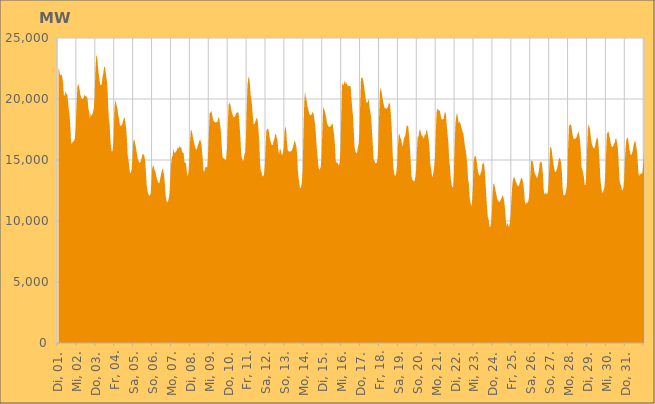
| Category | Series 0 |
|---|---|
|  Di, 01.  | 22526.912 |
|  Di, 01.  | 22406.47 |
|  Di, 01.  | 21989.148 |
|  Di, 01.  | 21965.443 |
|  Di, 01.  | 22028.439 |
|  Di, 01.  | 21820.703 |
|  Di, 01.  | 21253.685 |
|  Di, 01.  | 20283.71 |
|  Di, 01.  | 20286.872 |
|  Di, 01.  | 20639.085 |
|  Di, 01.  | 20378.123 |
|  Di, 01.  | 20430.647 |
|  Di, 01.  | 19952.085 |
|  Di, 01.  | 19266.77 |
|  Di, 01.  | 18798.444 |
|  Di, 01.  | 17992.358 |
|  Di, 01.  | 16539.653 |
|  Mi, 02.  | 16284.732 |
|  Mi, 02.  | 16468.351 |
|  Mi, 02.  | 16555.082 |
|  Mi, 02.  | 16588.426 |
|  Mi, 02.  | 16804.583 |
|  Mi, 02.  | 17676.935 |
|  Mi, 02.  | 19455.206 |
|  Mi, 02.  | 20907.275 |
|  Mi, 02.  | 21263.114 |
|  Mi, 02.  | 21076.309 |
|  Mi, 02.  | 20719.563 |
|  Mi, 02.  | 20308.935 |
|  Mi, 02.  | 20105.747 |
|  Mi, 02.  | 20027.46 |
|  Mi, 02.  | 19998.727 |
|  Mi, 02.  | 20086.994 |
|  Mi, 02.  | 20356.165 |
|  Mi, 02.  | 20253.7 |
|  Mi, 02.  | 20218.26 |
|  Mi, 02.  | 20175.446 |
|  Mi, 02.  | 20010.15 |
|  Mi, 02.  | 19281.716 |
|  Mi, 02.  | 18906.304 |
|  Mi, 02.  | 18372.11 |
|  Do, 03.  | 18882.86 |
|  Do, 03.  | 18619.857 |
|  Do, 03.  | 18733.641 |
|  Do, 03.  | 18971.01 |
|  Do, 03.  | 19254.271 |
|  Do, 03.  | 20239.907 |
|  Do, 03.  | 22328.887 |
|  Do, 03.  | 23492.492 |
|  Do, 03.  | 23588.237 |
|  Do, 03.  | 22831.201 |
|  Do, 03.  | 22163.632 |
|  Do, 03.  | 21636.121 |
|  Do, 03.  | 21193.936 |
|  Do, 03.  | 21118.185 |
|  Do, 03.  | 21237.434 |
|  Do, 03.  | 21796.794 |
|  Do, 03.  | 22096.659 |
|  Do, 03.  | 22604.857 |
|  Do, 03.  | 22661.318 |
|  Do, 03.  | 22188.368 |
|  Do, 03.  | 21771.582 |
|  Do, 03.  | 21208.761 |
|  Do, 03.  | 19807.59 |
|  Do, 03.  | 18420.216 |
|  Fr, 04.  | 17906.003 |
|  Fr, 04.  | 16696.859 |
|  Fr, 04.  | 15925.515 |
|  Fr, 04.  | 15645.8 |
|  Fr, 04.  | 15858.253 |
|  Fr, 04.  | 16788.981 |
|  Fr, 04.  | 18909.759 |
|  Fr, 04.  | 19889.047 |
|  Fr, 04.  | 19709.015 |
|  Fr, 04.  | 19441.737 |
|  Fr, 04.  | 19157.858 |
|  Fr, 04.  | 18656.159 |
|  Fr, 04.  | 18346.415 |
|  Fr, 04.  | 17889.253 |
|  Fr, 04.  | 17779.888 |
|  Fr, 04.  | 17839.608 |
|  Fr, 04.  | 17947.852 |
|  Fr, 04.  | 18161.034 |
|  Fr, 04.  | 18440.259 |
|  Fr, 04.  | 18484.526 |
|  Fr, 04.  | 18109.087 |
|  Fr, 04.  | 17586.284 |
|  Fr, 04.  | 16702.706 |
|  Fr, 04.  | 15339.548 |
|  Sa, 05.  | 15013.379 |
|  Sa, 05.  | 14373.271 |
|  Sa, 05.  | 13910.728 |
|  Sa, 05.  | 13967.228 |
|  Sa, 05.  | 14259.186 |
|  Sa, 05.  | 15199.529 |
|  Sa, 05.  | 16476.257 |
|  Sa, 05.  | 16725.637 |
|  Sa, 05.  | 16494.763 |
|  Sa, 05.  | 16168.45 |
|  Sa, 05.  | 15797.181 |
|  Sa, 05.  | 15378.961 |
|  Sa, 05.  | 15044.083 |
|  Sa, 05.  | 14900.307 |
|  Sa, 05.  | 14771.241 |
|  Sa, 05.  | 14808.563 |
|  Sa, 05.  | 14999.536 |
|  Sa, 05.  | 15223.081 |
|  Sa, 05.  | 15521.74 |
|  Sa, 05.  | 15457.824 |
|  Sa, 05.  | 15353.393 |
|  Sa, 05.  | 14994.231 |
|  Sa, 05.  | 14109.299 |
|  Sa, 05.  | 12972.196 |
|  So, 06.  | 12494.59 |
|  So, 06.  | 12216.455 |
|  So, 06.  | 12082.395 |
|  So, 06.  | 12083.266 |
|  So, 06.  | 12243.293 |
|  So, 06.  | 13039.565 |
|  So, 06.  | 14276.084 |
|  So, 06.  | 14533.343 |
|  So, 06.  | 14490.629 |
|  So, 06.  | 14193.132 |
|  So, 06.  | 14085.759 |
|  So, 06.  | 13745.845 |
|  So, 06.  | 13478.791 |
|  So, 06.  | 13263.798 |
|  So, 06.  | 13118.89 |
|  So, 06.  | 13078.676 |
|  So, 06.  | 13414.69 |
|  So, 06.  | 13719.299 |
|  So, 06.  | 14025.836 |
|  So, 06.  | 14294.314 |
|  So, 06.  | 14176.101 |
|  So, 06.  | 13798.821 |
|  So, 06.  | 13132.193 |
|  So, 06.  | 12130.515 |
|  Mo, 07.  | 11707.894 |
|  Mo, 07.  | 11531.707 |
|  Mo, 07.  | 11589.601 |
|  Mo, 07.  | 11853.566 |
|  Mo, 07.  | 12245.742 |
|  Mo, 07.  | 13436.887 |
|  Mo, 07.  | 14651.123 |
|  Mo, 07.  | 15201.346 |
|  Mo, 07.  | 15355.351 |
|  Mo, 07.  | 15922.268 |
|  Mo, 07.  | 15621.598 |
|  Mo, 07.  | 15552.456 |
|  Mo, 07.  | 15724.299 |
|  Mo, 07.  | 15712.635 |
|  Mo, 07.  | 16048.927 |
|  Mo, 07.  | 15896.468 |
|  Mo, 07.  | 16047.564 |
|  Mo, 07.  | 16150.723 |
|  Mo, 07.  | 15969.989 |
|  Mo, 07.  | 16069.592 |
|  Mo, 07.  | 15604.495 |
|  Mo, 07.  | 15636.897 |
|  Mo, 07.  | 15528.732 |
|  Mo, 07.  | 14835.553 |
|  Di, 08.  | 14733.031 |
|  Di, 08.  | 14748.741 |
|  Di, 08.  | 14028.525 |
|  Di, 08.  | 13657.229 |
|  Di, 08.  | 13915.883 |
|  Di, 08.  | 14780.843 |
|  Di, 08.  | 16301.061 |
|  Di, 08.  | 17425.302 |
|  Di, 08.  | 17452.317 |
|  Di, 08.  | 17147.888 |
|  Di, 08.  | 16764.146 |
|  Di, 08.  | 16486.477 |
|  Di, 08.  | 16184.566 |
|  Di, 08.  | 15964.736 |
|  Di, 08.  | 15834.102 |
|  Di, 08.  | 15957.729 |
|  Di, 08.  | 16231.03 |
|  Di, 08.  | 16370.161 |
|  Di, 08.  | 16590.919 |
|  Di, 08.  | 16652.988 |
|  Di, 08.  | 16443.024 |
|  Di, 08.  | 16019.567 |
|  Di, 08.  | 15200.475 |
|  Di, 08.  | 14173.778 |
|  Mi, 09.  | 14017.101 |
|  Mi, 09.  | 14266.042 |
|  Mi, 09.  | 14443.907 |
|  Mi, 09.  | 14422.802 |
|  Mi, 09.  | 14401.03 |
|  Mi, 09.  | 15574.663 |
|  Mi, 09.  | 17292.631 |
|  Mi, 09.  | 18897.011 |
|  Mi, 09.  | 18856.916 |
|  Mi, 09.  | 19051.52 |
|  Mi, 09.  | 18794.25 |
|  Mi, 09.  | 18414.661 |
|  Mi, 09.  | 18192.065 |
|  Mi, 09.  | 18125.121 |
|  Mi, 09.  | 18090.815 |
|  Mi, 09.  | 18062.45 |
|  Mi, 09.  | 18137.342 |
|  Mi, 09.  | 18136.437 |
|  Mi, 09.  | 18482.14 |
|  Mi, 09.  | 18421.358 |
|  Mi, 09.  | 18004.306 |
|  Mi, 09.  | 17496.166 |
|  Mi, 09.  | 16550.939 |
|  Mi, 09.  | 15410.359 |
|  Do, 10.  | 15119.629 |
|  Do, 10.  | 15183.507 |
|  Do, 10.  | 15071.974 |
|  Do, 10.  | 14966.261 |
|  Do, 10.  | 15137.744 |
|  Do, 10.  | 16026.179 |
|  Do, 10.  | 17925.751 |
|  Do, 10.  | 19515.594 |
|  Do, 10.  | 19696.68 |
|  Do, 10.  | 19585.983 |
|  Do, 10.  | 19268.079 |
|  Do, 10.  | 18924.803 |
|  Do, 10.  | 18759.811 |
|  Do, 10.  | 18477.662 |
|  Do, 10.  | 18566.214 |
|  Do, 10.  | 18533.357 |
|  Do, 10.  | 18727.805 |
|  Do, 10.  | 18855.984 |
|  Do, 10.  | 18874.741 |
|  Do, 10.  | 18974.651 |
|  Do, 10.  | 18686.039 |
|  Do, 10.  | 17777.635 |
|  Do, 10.  | 16852.575 |
|  Do, 10.  | 15458.143 |
|  Fr, 11.  | 15195.523 |
|  Fr, 11.  | 14925.869 |
|  Fr, 11.  | 14988.396 |
|  Fr, 11.  | 15442.18 |
|  Fr, 11.  | 15612.721 |
|  Fr, 11.  | 16771.007 |
|  Fr, 11.  | 19282.902 |
|  Fr, 11.  | 21147.253 |
|  Fr, 11.  | 21735.256 |
|  Fr, 11.  | 21833.098 |
|  Fr, 11.  | 21275.279 |
|  Fr, 11.  | 20322.106 |
|  Fr, 11.  | 19973.58 |
|  Fr, 11.  | 19248.71 |
|  Fr, 11.  | 18435.339 |
|  Fr, 11.  | 17881.92 |
|  Fr, 11.  | 17970.333 |
|  Fr, 11.  | 18148.065 |
|  Fr, 11.  | 18352.172 |
|  Fr, 11.  | 18464.913 |
|  Fr, 11.  | 18235.119 |
|  Fr, 11.  | 17433.781 |
|  Fr, 11.  | 16336.593 |
|  Fr, 11.  | 14740.526 |
|  Sa, 12.  | 14063.681 |
|  Sa, 12.  | 13963.783 |
|  Sa, 12.  | 13664.512 |
|  Sa, 12.  | 13673.739 |
|  Sa, 12.  | 13832.718 |
|  Sa, 12.  | 14575.779 |
|  Sa, 12.  | 16135.305 |
|  Sa, 12.  | 17388.972 |
|  Sa, 12.  | 17531.61 |
|  Sa, 12.  | 17589.011 |
|  Sa, 12.  | 17359.931 |
|  Sa, 12.  | 16906.124 |
|  Sa, 12.  | 16586.876 |
|  Sa, 12.  | 16349.439 |
|  Sa, 12.  | 16215.266 |
|  Sa, 12.  | 16240.346 |
|  Sa, 12.  | 16514.791 |
|  Sa, 12.  | 16721.8 |
|  Sa, 12.  | 17052.526 |
|  Sa, 12.  | 17156.347 |
|  Sa, 12.  | 16829.289 |
|  Sa, 12.  | 16638.301 |
|  Sa, 12.  | 15925.466 |
|  Sa, 12.  | 15437.057 |
|  So, 13.  | 15888.361 |
|  So, 13.  | 15887.24 |
|  So, 13.  | 15504.571 |
|  So, 13.  | 15374.934 |
|  So, 13.  | 15608.242 |
|  So, 13.  | 16032.022 |
|  So, 13.  | 17238.008 |
|  So, 13.  | 17763.354 |
|  So, 13.  | 17504.365 |
|  So, 13.  | 16526.702 |
|  So, 13.  | 15830.428 |
|  So, 13.  | 15694.014 |
|  So, 13.  | 15679.876 |
|  So, 13.  | 15733.994 |
|  So, 13.  | 15693.882 |
|  So, 13.  | 15771.486 |
|  So, 13.  | 15908.227 |
|  So, 13.  | 16113.323 |
|  So, 13.  | 16410.521 |
|  So, 13.  | 16613.464 |
|  So, 13.  | 16375.777 |
|  So, 13.  | 16112.359 |
|  So, 13.  | 15404.713 |
|  So, 13.  | 14037.079 |
|  Mo, 14.  | 13476.801 |
|  Mo, 14.  | 12973.884 |
|  Mo, 14.  | 12633.295 |
|  Mo, 14.  | 12816.908 |
|  Mo, 14.  | 13182.102 |
|  Mo, 14.  | 14145.974 |
|  Mo, 14.  | 16957.51 |
|  Mo, 14.  | 19656.985 |
|  Mo, 14.  | 20613.038 |
|  Mo, 14.  | 20150.235 |
|  Mo, 14.  | 19894.408 |
|  Mo, 14.  | 19426.355 |
|  Mo, 14.  | 19170.464 |
|  Mo, 14.  | 18876.056 |
|  Mo, 14.  | 18702.658 |
|  Mo, 14.  | 18656.22 |
|  Mo, 14.  | 18705.132 |
|  Mo, 14.  | 18834.779 |
|  Mo, 14.  | 18974.108 |
|  Mo, 14.  | 18704.651 |
|  Mo, 14.  | 18301.995 |
|  Mo, 14.  | 17765.942 |
|  Mo, 14.  | 16924.558 |
|  Mo, 14.  | 15936.615 |
|  Di, 15.  | 15237.081 |
|  Di, 15.  | 14487.489 |
|  Di, 15.  | 14195.239 |
|  Di, 15.  | 14277.458 |
|  Di, 15.  | 14469.942 |
|  Di, 15.  | 15276.696 |
|  Di, 15.  | 17315.359 |
|  Di, 15.  | 19324.281 |
|  Di, 15.  | 19178.443 |
|  Di, 15.  | 19047.041 |
|  Di, 15.  | 18726.516 |
|  Di, 15.  | 18439.443 |
|  Di, 15.  | 18007.494 |
|  Di, 15.  | 17857.089 |
|  Di, 15.  | 17731.751 |
|  Di, 15.  | 17750.383 |
|  Di, 15.  | 17713.955 |
|  Di, 15.  | 17826.648 |
|  Di, 15.  | 17925.174 |
|  Di, 15.  | 17983.521 |
|  Di, 15.  | 17489.976 |
|  Di, 15.  | 17039.398 |
|  Di, 15.  | 16233.326 |
|  Di, 15.  | 14902.971 |
|  Mi, 16.  | 14776.786 |
|  Mi, 16.  | 14808.93 |
|  Mi, 16.  | 14677.12 |
|  Mi, 16.  | 14539.716 |
|  Mi, 16.  | 14810.283 |
|  Mi, 16.  | 15747.825 |
|  Mi, 16.  | 18653.757 |
|  Mi, 16.  | 21281.91 |
|  Mi, 16.  | 21197.543 |
|  Mi, 16.  | 21087.541 |
|  Mi, 16.  | 21526.291 |
|  Mi, 16.  | 21191.602 |
|  Mi, 16.  | 21410.399 |
|  Mi, 16.  | 21234.078 |
|  Mi, 16.  | 21100.96 |
|  Mi, 16.  | 21049.718 |
|  Mi, 16.  | 21065.437 |
|  Mi, 16.  | 21058.798 |
|  Mi, 16.  | 21029.395 |
|  Mi, 16.  | 20011.342 |
|  Mi, 16.  | 19231.392 |
|  Mi, 16.  | 18521.338 |
|  Mi, 16.  | 17235.764 |
|  Mi, 16.  | 15986.345 |
|  Do, 17.  | 15681.916 |
|  Do, 17.  | 15547.501 |
|  Do, 17.  | 15581.865 |
|  Do, 17.  | 15998.182 |
|  Do, 17.  | 16298.651 |
|  Do, 17.  | 17105.585 |
|  Do, 17.  | 19487.417 |
|  Do, 17.  | 21675.183 |
|  Do, 17.  | 21751.311 |
|  Do, 17.  | 21755.726 |
|  Do, 17.  | 21406.647 |
|  Do, 17.  | 21035.782 |
|  Do, 17.  | 20561.875 |
|  Do, 17.  | 19998.641 |
|  Do, 17.  | 19684.349 |
|  Do, 17.  | 19695.941 |
|  Do, 17.  | 19824.176 |
|  Do, 17.  | 20027.321 |
|  Do, 17.  | 19270.498 |
|  Do, 17.  | 18901.677 |
|  Do, 17.  | 18464.156 |
|  Do, 17.  | 17381.889 |
|  Do, 17.  | 16317.945 |
|  Do, 17.  | 15113.643 |
|  Fr, 18.  | 14914.141 |
|  Fr, 18.  | 14786.128 |
|  Fr, 18.  | 14676.584 |
|  Fr, 18.  | 14806.41 |
|  Fr, 18.  | 15074.077 |
|  Fr, 18.  | 16273.308 |
|  Fr, 18.  | 18477.24 |
|  Fr, 18.  | 20465.388 |
|  Fr, 18.  | 20945.024 |
|  Fr, 18.  | 20631.941 |
|  Fr, 18.  | 20264.589 |
|  Fr, 18.  | 19821.216 |
|  Fr, 18.  | 19528.798 |
|  Fr, 18.  | 19250.162 |
|  Fr, 18.  | 19272.097 |
|  Fr, 18.  | 19191.204 |
|  Fr, 18.  | 19256.205 |
|  Fr, 18.  | 19295.226 |
|  Fr, 18.  | 19585.866 |
|  Fr, 18.  | 19726.097 |
|  Fr, 18.  | 19495.893 |
|  Fr, 18.  | 18670.143 |
|  Fr, 18.  | 17692.273 |
|  Fr, 18.  | 15902.273 |
|  Sa, 19.  | 14502.991 |
|  Sa, 19.  | 13963.813 |
|  Sa, 19.  | 13705.281 |
|  Sa, 19.  | 13750.522 |
|  Sa, 19.  | 14004.255 |
|  Sa, 19.  | 14751.214 |
|  Sa, 19.  | 16232.76 |
|  Sa, 19.  | 17143.528 |
|  Sa, 19.  | 17104.293 |
|  Sa, 19.  | 16798.157 |
|  Sa, 19.  | 16708.191 |
|  Sa, 19.  | 16330.126 |
|  Sa, 19.  | 16085.458 |
|  Sa, 19.  | 16549.678 |
|  Sa, 19.  | 16913.248 |
|  Sa, 19.  | 16915.412 |
|  Sa, 19.  | 17334.022 |
|  Sa, 19.  | 17822.379 |
|  Sa, 19.  | 17814.016 |
|  Sa, 19.  | 17759.341 |
|  Sa, 19.  | 17057.23 |
|  Sa, 19.  | 16149.379 |
|  Sa, 19.  | 15036.152 |
|  Sa, 19.  | 13746.208 |
|  So, 20.  | 13369.458 |
|  So, 20.  | 13358.264 |
|  So, 20.  | 13229.817 |
|  So, 20.  | 13295.895 |
|  So, 20.  | 13552.034 |
|  So, 20.  | 14199.279 |
|  So, 20.  | 15706.707 |
|  So, 20.  | 16940 |
|  So, 20.  | 16911.133 |
|  So, 20.  | 17396.388 |
|  So, 20.  | 17516.265 |
|  So, 20.  | 17230.456 |
|  So, 20.  | 17022.303 |
|  So, 20.  | 16971.989 |
|  So, 20.  | 16822.458 |
|  So, 20.  | 16775.052 |
|  So, 20.  | 17120.736 |
|  So, 20.  | 17052.948 |
|  So, 20.  | 17410.084 |
|  So, 20.  | 17476.238 |
|  So, 20.  | 17024.958 |
|  So, 20.  | 16684.188 |
|  So, 20.  | 15859.638 |
|  So, 20.  | 14665.222 |
|  Mo, 21.  | 14296.998 |
|  Mo, 21.  | 13789.764 |
|  Mo, 21.  | 13595.78 |
|  Mo, 21.  | 14018.2 |
|  Mo, 21.  | 14445.537 |
|  Mo, 21.  | 15320.487 |
|  Mo, 21.  | 17221.923 |
|  Mo, 21.  | 18939.394 |
|  Mo, 21.  | 19195.436 |
|  Mo, 21.  | 19175.394 |
|  Mo, 21.  | 18979.449 |
|  Mo, 21.  | 19114.569 |
|  Mo, 21.  | 18707.271 |
|  Mo, 21.  | 18416.339 |
|  Mo, 21.  | 18286.2 |
|  Mo, 21.  | 18363.909 |
|  Mo, 21.  | 18368.367 |
|  Mo, 21.  | 18845.3 |
|  Mo, 21.  | 18943.034 |
|  Mo, 21.  | 18643.547 |
|  Mo, 21.  | 17748.368 |
|  Mo, 21.  | 17043.219 |
|  Mo, 21.  | 16376.424 |
|  Mo, 21.  | 14968.571 |
|  Di, 22.  | 14435.309 |
|  Di, 22.  | 13491.145 |
|  Di, 22.  | 13025.626 |
|  Di, 22.  | 12720.19 |
|  Di, 22.  | 12835.06 |
|  Di, 22.  | 13915.996 |
|  Di, 22.  | 16426.17 |
|  Di, 22.  | 18070.597 |
|  Di, 22.  | 18599.134 |
|  Di, 22.  | 18894.87 |
|  Di, 22.  | 18415.453 |
|  Di, 22.  | 18014.024 |
|  Di, 22.  | 18170.617 |
|  Di, 22.  | 18002.731 |
|  Di, 22.  | 17810.405 |
|  Di, 22.  | 17546.177 |
|  Di, 22.  | 17299.541 |
|  Di, 22.  | 17168.594 |
|  Di, 22.  | 16657.446 |
|  Di, 22.  | 16098.036 |
|  Di, 22.  | 15776.306 |
|  Di, 22.  | 15317.999 |
|  Di, 22.  | 14438.937 |
|  Di, 22.  | 13410.637 |
|  Mi, 23.  | 13037.93 |
|  Mi, 23.  | 11921.344 |
|  Mi, 23.  | 11501.122 |
|  Mi, 23.  | 11198.114 |
|  Mi, 23.  | 11558.03 |
|  Mi, 23.  | 12728.661 |
|  Mi, 23.  | 14812.064 |
|  Mi, 23.  | 15252.596 |
|  Mi, 23.  | 15372.199 |
|  Mi, 23.  | 15202.798 |
|  Mi, 23.  | 14842.103 |
|  Mi, 23.  | 14284.935 |
|  Mi, 23.  | 13967.494 |
|  Mi, 23.  | 13763.306 |
|  Mi, 23.  | 13718.893 |
|  Mi, 23.  | 13931.398 |
|  Mi, 23.  | 14103.331 |
|  Mi, 23.  | 14663.13 |
|  Mi, 23.  | 14683.096 |
|  Mi, 23.  | 14795.26 |
|  Mi, 23.  | 14242.368 |
|  Mi, 23.  | 13305.199 |
|  Mi, 23.  | 12152.755 |
|  Mi, 23.  | 11105.004 |
|  Do, 24.  | 10352.406 |
|  Do, 24.  | 10138.996 |
|  Do, 24.  | 9550.987 |
|  Do, 24.  | 9517.172 |
|  Do, 24.  | 9756.606 |
|  Do, 24.  | 10605.358 |
|  Do, 24.  | 12043.036 |
|  Do, 24.  | 13039.984 |
|  Do, 24.  | 13059.124 |
|  Do, 24.  | 12774.887 |
|  Do, 24.  | 12458.406 |
|  Do, 24.  | 12136.451 |
|  Do, 24.  | 11782.163 |
|  Do, 24.  | 11681.057 |
|  Do, 24.  | 11599.215 |
|  Do, 24.  | 11528.997 |
|  Do, 24.  | 11706.046 |
|  Do, 24.  | 11812.292 |
|  Do, 24.  | 11948.284 |
|  Do, 24.  | 12140.702 |
|  Do, 24.  | 11909.382 |
|  Do, 24.  | 11549.325 |
|  Do, 24.  | 10890.738 |
|  Do, 24.  | 10026.234 |
|  Fr, 25.  | 9527.227 |
|  Fr, 25.  | 9873.825 |
|  Fr, 25.  | 9651.963 |
|  Fr, 25.  | 9510.427 |
|  Fr, 25.  | 9848.435 |
|  Fr, 25.  | 10572.14 |
|  Fr, 25.  | 11812.89 |
|  Fr, 25.  | 12862.782 |
|  Fr, 25.  | 13407.576 |
|  Fr, 25.  | 13551.772 |
|  Fr, 25.  | 13564.523 |
|  Fr, 25.  | 13326.728 |
|  Fr, 25.  | 13164.655 |
|  Fr, 25.  | 12969.235 |
|  Fr, 25.  | 12889.706 |
|  Fr, 25.  | 12848.493 |
|  Fr, 25.  | 12998.515 |
|  Fr, 25.  | 13243.538 |
|  Fr, 25.  | 13463.82 |
|  Fr, 25.  | 13572.139 |
|  Fr, 25.  | 13390.415 |
|  Fr, 25.  | 13065.154 |
|  Fr, 25.  | 12497.573 |
|  Fr, 25.  | 11605.246 |
|  Sa, 26.  | 11331.031 |
|  Sa, 26.  | 11538.966 |
|  Sa, 26.  | 11452.545 |
|  Sa, 26.  | 11552.465 |
|  Sa, 26.  | 11814.562 |
|  Sa, 26.  | 12446.114 |
|  Sa, 26.  | 13680.892 |
|  Sa, 26.  | 14963.27 |
|  Sa, 26.  | 14936.747 |
|  Sa, 26.  | 14866.556 |
|  Sa, 26.  | 14556.576 |
|  Sa, 26.  | 14088.614 |
|  Sa, 26.  | 13828.932 |
|  Sa, 26.  | 13710.264 |
|  Sa, 26.  | 13530.954 |
|  Sa, 26.  | 13589.313 |
|  Sa, 26.  | 13867.144 |
|  Sa, 26.  | 14200.274 |
|  Sa, 26.  | 14805.246 |
|  Sa, 26.  | 14841.866 |
|  Sa, 26.  | 14860.49 |
|  Sa, 26.  | 14515.496 |
|  Sa, 26.  | 13771.561 |
|  Sa, 26.  | 12489.411 |
|  So, 27.  | 12151.367 |
|  So, 27.  | 12298.593 |
|  So, 27.  | 12312.623 |
|  So, 27.  | 12156.948 |
|  So, 27.  | 12334.318 |
|  So, 27.  | 12947.195 |
|  So, 27.  | 14314.421 |
|  So, 27.  | 16007.234 |
|  So, 27.  | 16065.315 |
|  So, 27.  | 15865.218 |
|  So, 27.  | 15318.922 |
|  So, 27.  | 14811.937 |
|  So, 27.  | 14466.274 |
|  So, 27.  | 14063.205 |
|  So, 27.  | 14012.236 |
|  So, 27.  | 14103.637 |
|  So, 27.  | 14338.946 |
|  So, 27.  | 14659.36 |
|  So, 27.  | 15039.797 |
|  So, 27.  | 15185.619 |
|  So, 27.  | 15074.202 |
|  So, 27.  | 14764.255 |
|  So, 27.  | 14031.377 |
|  So, 27.  | 12634.499 |
|  Mo, 28.  | 12103.434 |
|  Mo, 28.  | 12130.368 |
|  Mo, 28.  | 12095.216 |
|  Mo, 28.  | 12385.196 |
|  Mo, 28.  | 12746.634 |
|  Mo, 28.  | 13750.16 |
|  Mo, 28.  | 16168.857 |
|  Mo, 28.  | 17771.19 |
|  Mo, 28.  | 17872.232 |
|  Mo, 28.  | 17930.041 |
|  Mo, 28.  | 17823.27 |
|  Mo, 28.  | 17295.328 |
|  Mo, 28.  | 16950.699 |
|  Mo, 28.  | 16725.541 |
|  Mo, 28.  | 16711.393 |
|  Mo, 28.  | 16764.673 |
|  Mo, 28.  | 16817.846 |
|  Mo, 28.  | 16930.92 |
|  Mo, 28.  | 17160.146 |
|  Mo, 28.  | 17325.481 |
|  Mo, 28.  | 17060.342 |
|  Mo, 28.  | 16626.08 |
|  Mo, 28.  | 15839.505 |
|  Mo, 28.  | 14400.11 |
|  Di, 29.  | 14220.138 |
|  Di, 29.  | 13899.738 |
|  Di, 29.  | 13613.192 |
|  Di, 29.  | 12946.958 |
|  Di, 29.  | 12954.28 |
|  Di, 29.  | 13872.883 |
|  Di, 29.  | 15852.932 |
|  Di, 29.  | 17513.372 |
|  Di, 29.  | 17936.582 |
|  Di, 29.  | 17723.749 |
|  Di, 29.  | 17313.06 |
|  Di, 29.  | 16728.697 |
|  Di, 29.  | 16332.197 |
|  Di, 29.  | 16124.415 |
|  Di, 29.  | 16001.33 |
|  Di, 29.  | 15917.988 |
|  Di, 29.  | 16108.193 |
|  Di, 29.  | 16465.284 |
|  Di, 29.  | 16735.313 |
|  Di, 29.  | 16878.007 |
|  Di, 29.  | 16575.179 |
|  Di, 29.  | 15802.26 |
|  Di, 29.  | 14621.828 |
|  Di, 29.  | 13348.565 |
|  Mi, 30.  | 12780.106 |
|  Mi, 30.  | 12385.636 |
|  Mi, 30.  | 12301.168 |
|  Mi, 30.  | 12566.867 |
|  Mi, 30.  | 12776.628 |
|  Mi, 30.  | 13601.726 |
|  Mi, 30.  | 15289.125 |
|  Mi, 30.  | 17100.243 |
|  Mi, 30.  | 17277.758 |
|  Mi, 30.  | 17354.569 |
|  Mi, 30.  | 17061.927 |
|  Mi, 30.  | 16749.407 |
|  Mi, 30.  | 16374.353 |
|  Mi, 30.  | 16116.871 |
|  Mi, 30.  | 16083.983 |
|  Mi, 30.  | 16108.895 |
|  Mi, 30.  | 16284.87 |
|  Mi, 30.  | 16415.018 |
|  Mi, 30.  | 16741.364 |
|  Mi, 30.  | 16776.821 |
|  Mi, 30.  | 16432.691 |
|  Mi, 30.  | 16038.45 |
|  Mi, 30.  | 14955.685 |
|  Mi, 30.  | 13455.883 |
|  Do, 31.  | 12960.824 |
|  Do, 31.  | 13005.616 |
|  Do, 31.  | 12564.975 |
|  Do, 31.  | 12496.927 |
|  Do, 31.  | 12704.898 |
|  Do, 31.  | 13381.74 |
|  Do, 31.  | 14966.904 |
|  Do, 31.  | 16072.489 |
|  Do, 31.  | 16699.759 |
|  Do, 31.  | 16841.452 |
|  Do, 31.  | 16781.206 |
|  Do, 31.  | 16273.065 |
|  Do, 31.  | 15799.312 |
|  Do, 31.  | 15499.793 |
|  Do, 31.  | 15390.734 |
|  Do, 31.  | 15536.496 |
|  Do, 31.  | 15793.018 |
|  Do, 31.  | 16187.823 |
|  Do, 31.  | 16472.593 |
|  Do, 31.  | 16594.795 |
|  Do, 31.  | 16261.092 |
|  Do, 31.  | 15873.743 |
|  Do, 31.  | 15251.373 |
|  Do, 31.  | 14044.522 |
|  Fr, 01.  | 13649.505 |
|  Fr, 01.  | 13914.51 |
|  Fr, 01.  | 13837.646 |
|  Fr, 01.  | 13898.363 |
|  Fr, 01.  | 13884.847 |
|  Fr, 01.  | 14455.853 |
|    | 15931.499 |